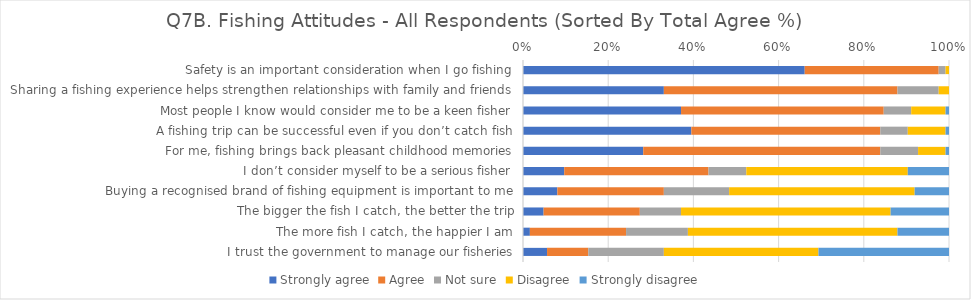
| Category | Strongly agree | Agree | Not sure | Disagree | Strongly disagree |
|---|---|---|---|---|---|
| Safety is an important consideration when I go fishing | 0.661 | 0.315 | 0.016 | 0.008 | 0 |
| Sharing a fishing experience helps strengthen relationships with family and friends | 0.331 | 0.548 | 0.097 | 0.024 | 0 |
| Most people I know would consider me to be a keen fisher | 0.371 | 0.476 | 0.065 | 0.081 | 0.008 |
| A fishing trip can be successful even if you don’t catch fish | 0.395 | 0.444 | 0.065 | 0.089 | 0.008 |
| For me, fishing brings back pleasant childhood memories | 0.282 | 0.556 | 0.089 | 0.065 | 0.008 |
| I don’t consider myself to be a serious fisher | 0.097 | 0.339 | 0.089 | 0.379 | 0.097 |
| Buying a recognised brand of fishing equipment is important to me | 0.081 | 0.25 | 0.153 | 0.435 | 0.081 |
| The bigger the fish I catch, the better the trip | 0.048 | 0.226 | 0.097 | 0.492 | 0.137 |
| The more fish I catch, the happier I am | 0.016 | 0.226 | 0.145 | 0.492 | 0.121 |
| I trust the government to manage our fisheries | 0.056 | 0.097 | 0.177 | 0.363 | 0.306 |